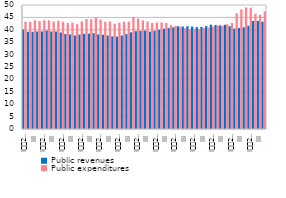
| Category | Public revenues | Public expenditures |
|---|---|---|
| I
2009 | 40.142 | 43.301 |
| II | 39.248 | 43.223 |
| III | 39.222 | 43.838 |
| IV | 39.342 | 43.508 |
| I
2010 | 39.346 | 43.863 |
| II | 39.739 | 43.782 |
| III | 39.332 | 43.371 |
| IV | 39.329 | 43.668 |
| I
2011 | 38.91 | 43.234 |
| II | 38.286 | 42.761 |
| III | 38.106 | 42.925 |
| IV | 37.723 | 42.248 |
| I
2012 | 38.07 | 43.358 |
| II | 38.382 | 44.317 |
| III | 38.438 | 44.213 |
| IV | 38.638 | 45.073 |
| I
2013 | 38.135 | 44.124 |
| II | 38.025 | 43.272 |
| III | 37.669 | 43.393 |
| IV | 37.321 | 42.467 |
| I
2014 | 37.243 | 42.885 |
| II | 37.683 | 43.315 |
| III | 38.291 | 43.303 |
| IV | 38.955 | 45.159 |
| I
2015 | 39.458 | 44.512 |
| II | 39.551 | 43.822 |
| III | 39.699 | 43.361 |
| IV | 39.277 | 42.734 |
| I
2016 | 39.606 | 42.904 |
| II | 40.005 | 42.995 |
| III | 40.46 | 42.748 |
| IV | 40.693 | 41.886 |
| I
2017 | 41.004 | 41.576 |
| II | 41.423 | 41.242 |
| III | 41.325 | 40.636 |
| IV | 41.452 | 40.353 |
| I
2018 | 41.31 | 40.396 |
| II | 41.084 | 40.234 |
| III | 41.165 | 40.656 |
| IV | 41.5 | 40.865 |
| I
2019 | 42.071 | 41.283 |
| II | 41.955 | 41.622 |
| III | 41.775 | 41.547 |
| IV | 42.025 | 42.23 |
| I
2020 | 41.431 | 42.791 |
| II | 40.461 | 46.68 |
| III | 40.756 | 48.187 |
| IV | 40.983 | 49.03 |
| I
2021 | 41.633 | 48.894 |
| II | 43.545 | 46.497 |
| III | 43.595 | 46.088 |
| IV | 43.261 | 47.399 |